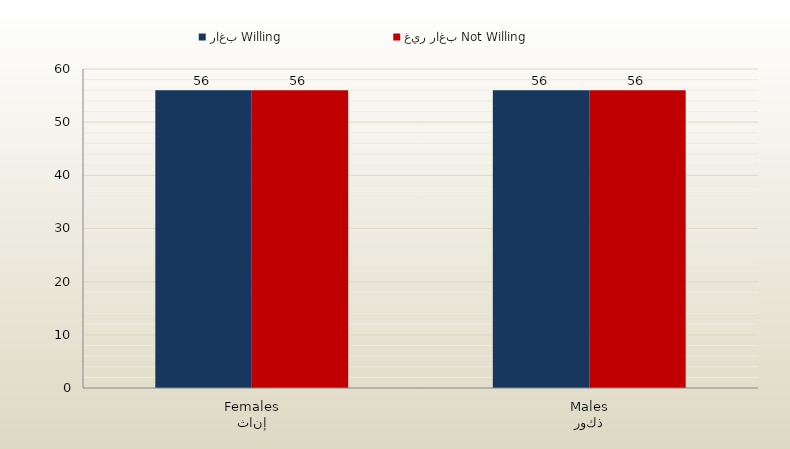
| Category | راغب Willing | غير راغب Not Willing |
|---|---|---|
| إناث
Females | 56 | 56 |
| ذكور
Males | 56 | 56 |